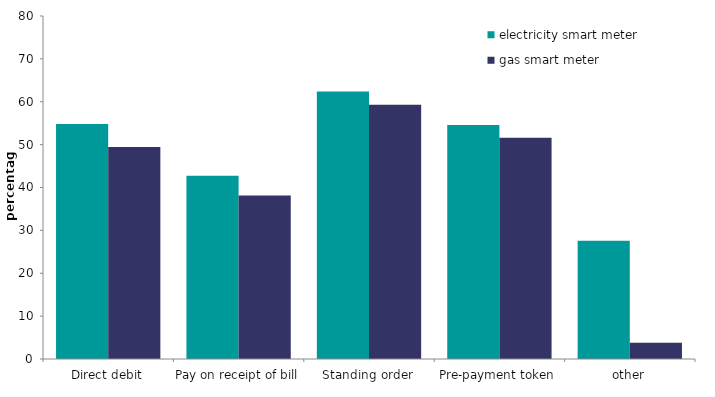
| Category | electricity smart meter | gas smart meter |
|---|---|---|
| Direct debit | 54.795 | 49.418 |
| Pay on receipt of bill | 42.717 | 38.134 |
| Standing order | 62.369 | 59.289 |
| Pre-payment token | 54.6 | 51.614 |
| other | 27.557 | 3.806 |